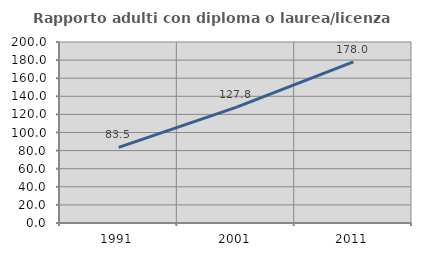
| Category | Rapporto adulti con diploma o laurea/licenza media  |
|---|---|
| 1991.0 | 83.528 |
| 2001.0 | 127.805 |
| 2011.0 | 177.969 |